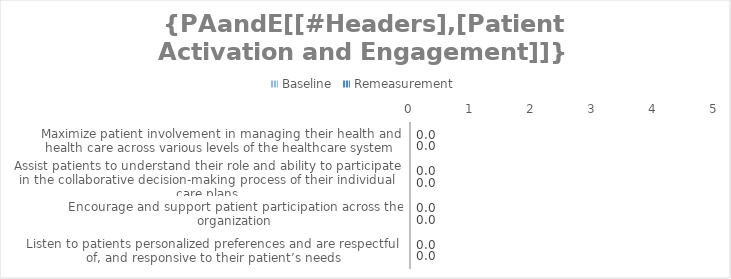
| Category | Baseline | Remeasurement |
|---|---|---|
| Maximize patient involvement in managing their health and health care across various levels of the healthcare system | 0 | 0 |
| Assist patients to understand their role and ability to participate in the collaborative decision-making process of their individual care plans | 0 | 0 |
| Encourage and support patient participation across the organization | 0 | 0 |
| Listen to patients personalized preferences and are respectful of, and responsive to their patient’s needs | 0 | 0 |